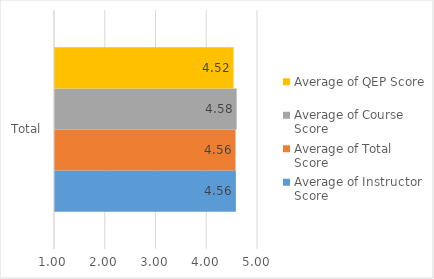
| Category | Average of Instructor Score | Average of Total Score | Average of Course Score | Average of QEP Score |
|---|---|---|---|---|
| Total | 4.564 | 4.557 | 4.579 | 4.519 |